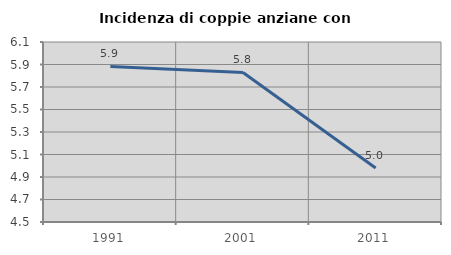
| Category | Incidenza di coppie anziane con figli |
|---|---|
| 1991.0 | 5.882 |
| 2001.0 | 5.83 |
| 2011.0 | 4.979 |